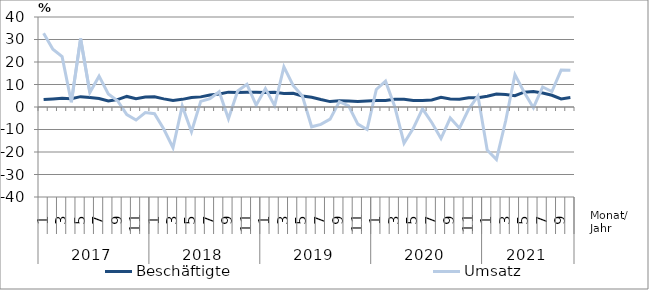
| Category | Beschäftigte | Umsatz |
|---|---|---|
| 0 | 3.3 | 32.8 |
| 1 | 3.6 | 25.7 |
| 2 | 3.9 | 22.4 |
| 3 | 3.7 | 2.1 |
| 4 | 4.6 | 30.4 |
| 5 | 4.2 | 6.4 |
| 6 | 3.8 | 13.7 |
| 7 | 2.7 | 5.8 |
| 8 | 3.3 | 2.8 |
| 9 | 4.7 | -3.4 |
| 10 | 3.7 | -5.8 |
| 11 | 4.4 | -2.5 |
| 12 | 4.5 | -3 |
| 13 | 3.6 | -9.8 |
| 14 | 2.9 | -18.1 |
| 15 | 3.4 | 0.5 |
| 16 | 4.2 | -11 |
| 17 | 4.5 | 2.5 |
| 18 | 5.3 | 3.7 |
| 19 | 5.8 | 6.8 |
| 20 | 6.6 | -5.2 |
| 21 | 6.5 | 7.1 |
| 22 | 6.6 | 10.1 |
| 23 | 6.6 | 0.8 |
| 24 | 6.4 | 8.2 |
| 25 | 6.5 | 0.6 |
| 26 | 6 | 17.8 |
| 27 | 6.1 | 9.6 |
| 28 | 4.9 | 4.9 |
| 29 | 4.3 | -8.8 |
| 30 | 3.3 | -7.7 |
| 31 | 2.4 | -5.4 |
| 32 | 2.8 | 2.4 |
| 33 | 2.7 | 0.5 |
| 34 | 2.5 | -7.6 |
| 35 | 2.7 | -10 |
| 36 | 2.9 | 7.8 |
| 37 | 2.9 | 11.5 |
| 38 | 3.4 | 0.1 |
| 39 | 3.4 | -16.1 |
| 40 | 2.9 | -9.5 |
| 41 | 2.9 | -0.8 |
| 42 | 3.1 | -6.9 |
| 43 | 4.3 | -14 |
| 44 | 3.6 | -4.9 |
| 45 | 3.4 | -9.4 |
| 46 | 4.1 | -0.9 |
| 47 | 4.1 | 4.9 |
| 48 | 4.8 | -19.1 |
| 49 | 5.8 | -23.3 |
| 50 | 5.6 | -6.1 |
| 51 | 5 | 14.4 |
| 52 | 6.6 | 6.6 |
| 53 | 6.9 | -0.3 |
| 54 | 6.2 | 8.9 |
| 55 | 5.2 | 6.9 |
| 56 | 3.6 | 16.4 |
| 57 | 4.2 | 16.3 |